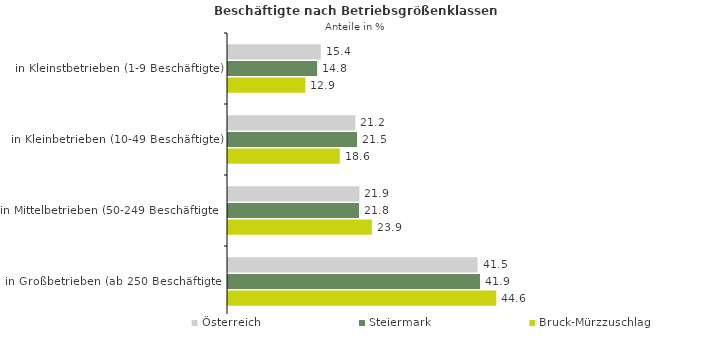
| Category | Österreich | Steiermark | Bruck-Mürzzuschlag |
|---|---|---|---|
| in Kleinstbetrieben (1-9 Beschäftigte) | 15.439 | 14.827 | 12.865 |
| in Kleinbetrieben (10-49 Beschäftigte) | 21.184 | 21.458 | 18.593 |
| in Mittelbetrieben (50-249 Beschäftigte) | 21.859 | 21.796 | 23.925 |
| in Großbetrieben (ab 250 Beschäftigte) | 41.518 | 41.919 | 44.619 |